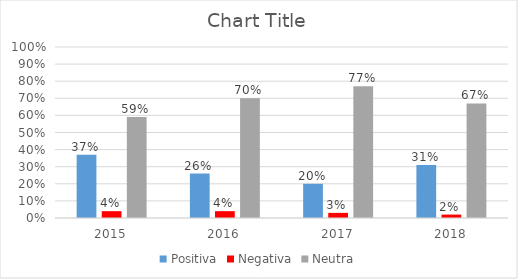
| Category | Positiva | Negativa | Neutra |
|---|---|---|---|
| 2015.0 | 0.37 | 0.04 | 0.59 |
| 2016.0 | 0.26 | 0.04 | 0.7 |
| 2017.0 | 0.2 | 0.03 | 0.77 |
| 2018.0 | 0.31 | 0.02 | 0.67 |